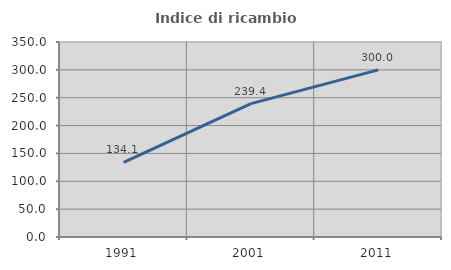
| Category | Indice di ricambio occupazionale  |
|---|---|
| 1991.0 | 134.081 |
| 2001.0 | 239.378 |
| 2011.0 | 300 |